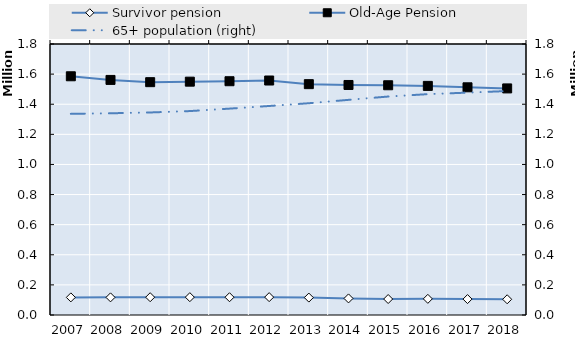
| Category | Survivor pension | Old-Age Pension | Series 4 | Series 5 | Series 6 | Series 7 | Series 8 | Series 9 | Series 10 | Series 11 | Series 12 | Series 13 | Series 14 | Series 15 | Series 16 | Series 17 | Series 18 | Series 19 |
|---|---|---|---|---|---|---|---|---|---|---|---|---|---|---|---|---|---|---|
| 2007.0 | 117056 | 1585636 |  |  |  |  |  |  |  |  |  |  |  |  |  |  |  |  |
| 2008.0 | 117114 | 1561507 |  |  |  |  |  |  |  |  |  |  |  |  |  |  |  |  |
| 2009.0 | 118192 | 1546477 |  |  |  |  |  |  |  |  |  |  |  |  |  |  |  |  |
| 2010.0 | 118458 | 1549849 |  |  |  |  |  |  |  |  |  |  |  |  |  |  |  |  |
| 2011.0 | 118012 | 1552706 |  |  |  |  |  |  |  |  |  |  |  |  |  |  |  |  |
| 2012.0 | 118632 | 1557396 |  |  |  |  |  |  |  |  |  |  |  |  |  |  |  |  |
| 2013.0 | 115674 | 1533339 |  |  |  |  |  |  |  |  |  |  |  |  |  |  |  |  |
| 2014.0 | 110143 | 1527877 |  |  |  |  |  |  |  |  |  |  |  |  |  |  |  |  |
| 2015.0 | 106113 | 1525999 |  |  |  |  |  |  |  |  |  |  |  |  |  |  |  |  |
| 2016.0 | 107228 | 1521778 |  |  |  |  |  |  |  |  |  |  |  |  |  |  |  |  |
| 2017.0 | 105719 | 1512345 |  |  |  |  |  |  |  |  |  |  |  |  |  |  |  |  |
| 2018.0 | 104493 | 1505017 |  |  |  |  |  |  |  |  |  |  |  |  |  |  |  |  |